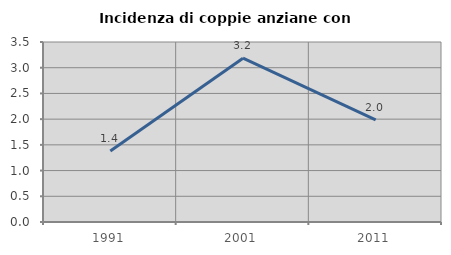
| Category | Incidenza di coppie anziane con figli |
|---|---|
| 1991.0 | 1.379 |
| 2001.0 | 3.185 |
| 2011.0 | 1.987 |